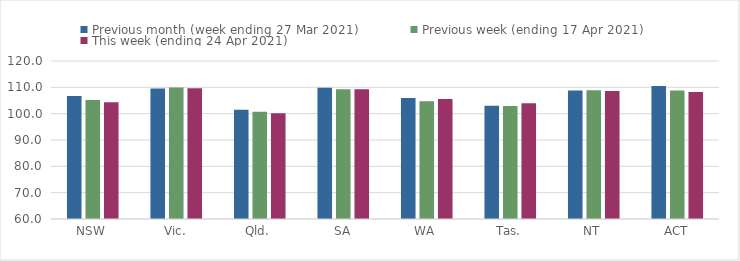
| Category | Previous month (week ending 27 Mar 2021) | Previous week (ending 17 Apr 2021) | This week (ending 24 Apr 2021) |
|---|---|---|---|
| NSW | 106.71 | 105.17 | 104.34 |
| Vic. | 109.52 | 109.92 | 109.69 |
| Qld. | 101.44 | 100.7 | 100.2 |
| SA | 109.83 | 109.31 | 109.3 |
| WA | 105.99 | 104.74 | 105.53 |
| Tas. | 103.01 | 102.92 | 103.96 |
| NT | 108.8 | 108.91 | 108.62 |
| ACT | 110.55 | 108.8 | 108.27 |